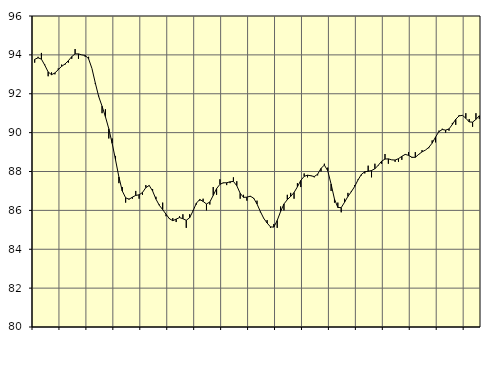
| Category | Piggar | Series 1 |
|---|---|---|
| nan | 93.6 | 93.77 |
| 87.0 | 93.9 | 93.85 |
| 87.0 | 94.1 | 93.78 |
| 87.0 | 93.5 | 93.47 |
| nan | 92.9 | 93.12 |
| 88.0 | 93.1 | 92.98 |
| 88.0 | 93 | 93.07 |
| 88.0 | 93.3 | 93.24 |
| nan | 93.5 | 93.41 |
| 89.0 | 93.5 | 93.53 |
| 89.0 | 93.6 | 93.7 |
| 89.0 | 93.8 | 93.91 |
| nan | 94.3 | 94.05 |
| 90.0 | 93.8 | 94.05 |
| 90.0 | 94 | 94 |
| 90.0 | 93.9 | 93.97 |
| nan | 93.9 | 93.8 |
| 91.0 | 93.3 | 93.3 |
| 91.0 | 92.5 | 92.55 |
| 91.0 | 91.9 | 91.86 |
| nan | 91 | 91.36 |
| 92.0 | 91.2 | 90.82 |
| 92.0 | 89.7 | 90.2 |
| 92.0 | 89.7 | 89.45 |
| nan | 88.8 | 88.6 |
| 93.0 | 87.4 | 87.72 |
| 93.0 | 87.2 | 87 |
| 93.0 | 86.4 | 86.65 |
| nan | 86.6 | 86.57 |
| 94.0 | 86.6 | 86.68 |
| 94.0 | 87 | 86.77 |
| 94.0 | 86.6 | 86.8 |
| nan | 86.8 | 86.92 |
| 95.0 | 87.3 | 87.17 |
| 95.0 | 87.3 | 87.28 |
| 95.0 | 87.1 | 87 |
| nan | 86.7 | 86.58 |
| 96.0 | 86.3 | 86.26 |
| 96.0 | 86.4 | 86.04 |
| 96.0 | 85.7 | 85.8 |
| nan | 85.6 | 85.57 |
| 97.0 | 85.6 | 85.47 |
| 97.0 | 85.4 | 85.55 |
| 97.0 | 85.7 | 85.63 |
| nan | 85.8 | 85.57 |
| 98.0 | 85.1 | 85.49 |
| 98.0 | 85.8 | 85.62 |
| 98.0 | 86 | 85.97 |
| nan | 86.3 | 86.37 |
| 99.0 | 86.5 | 86.56 |
| 99.0 | 86.6 | 86.46 |
| 99.0 | 86 | 86.33 |
| nan | 86.3 | 86.43 |
| 0.0 | 87.2 | 86.77 |
| 0.0 | 86.8 | 87.12 |
| 0.0 | 87.6 | 87.34 |
| nan | 87.4 | 87.42 |
| 1.0 | 87.3 | 87.42 |
| 1.0 | 87.4 | 87.47 |
| 1.0 | 87.7 | 87.49 |
| nan | 87.5 | 87.27 |
| 2.0 | 86.6 | 86.88 |
| 2.0 | 86.8 | 86.67 |
| 2.0 | 86.5 | 86.68 |
| nan | 86.7 | 86.73 |
| 3.0 | 86.6 | 86.63 |
| 3.0 | 86.5 | 86.33 |
| 3.0 | 85.9 | 85.94 |
| nan | 85.6 | 85.59 |
| 4.0 | 85.5 | 85.35 |
| 4.0 | 85.1 | 85.15 |
| 4.0 | 85.3 | 85.14 |
| nan | 85.1 | 85.48 |
| 5.0 | 86.2 | 85.94 |
| 5.0 | 86 | 86.33 |
| 5.0 | 86.8 | 86.55 |
| nan | 86.9 | 86.72 |
| 6.0 | 86.6 | 86.92 |
| 6.0 | 87.4 | 87.21 |
| 6.0 | 87.2 | 87.54 |
| nan | 87.9 | 87.75 |
| 7.0 | 87.7 | 87.81 |
| 7.0 | 87.8 | 87.78 |
| 7.0 | 87.7 | 87.74 |
| nan | 87.8 | 87.86 |
| 8.0 | 88 | 88.16 |
| 8.0 | 88.4 | 88.33 |
| 8.0 | 88.2 | 88.04 |
| nan | 87 | 87.35 |
| 9.0 | 86.4 | 86.58 |
| 9.0 | 86.4 | 86.15 |
| 9.0 | 85.9 | 86.14 |
| nan | 86.6 | 86.42 |
| 10.0 | 86.9 | 86.72 |
| 10.0 | 87 | 86.96 |
| 10.0 | 87.3 | 87.23 |
| nan | 87.6 | 87.57 |
| 11.0 | 87.8 | 87.85 |
| 11.0 | 87.9 | 87.99 |
| 11.0 | 88.3 | 88.01 |
| nan | 87.7 | 88.05 |
| 12.0 | 88.4 | 88.14 |
| 12.0 | 88.3 | 88.32 |
| 12.0 | 88.4 | 88.53 |
| nan | 88.9 | 88.64 |
| 13.0 | 88.4 | 88.65 |
| 13.0 | 88.6 | 88.6 |
| 13.0 | 88.5 | 88.59 |
| nan | 88.5 | 88.66 |
| 14.0 | 88.6 | 88.78 |
| 14.0 | 88.9 | 88.88 |
| 14.0 | 89 | 88.83 |
| nan | 88.7 | 88.73 |
| 15.0 | 89 | 88.73 |
| 15.0 | 88.9 | 88.88 |
| 15.0 | 89.1 | 89.01 |
| nan | 89.1 | 89.1 |
| 16.0 | 89.2 | 89.24 |
| 16.0 | 89.6 | 89.46 |
| 16.0 | 89.5 | 89.77 |
| nan | 90.1 | 90.05 |
| 17.0 | 90.2 | 90.16 |
| 17.0 | 90 | 90.13 |
| 17.0 | 90.1 | 90.19 |
| nan | 90.5 | 90.42 |
| 18.0 | 90.4 | 90.69 |
| 18.0 | 90.9 | 90.86 |
| 18.0 | 90.9 | 90.89 |
| nan | 91 | 90.74 |
| 19.0 | 90.7 | 90.55 |
| 19.0 | 90.3 | 90.54 |
| 19.0 | 91 | 90.68 |
| nan | 90.7 | 90.87 |